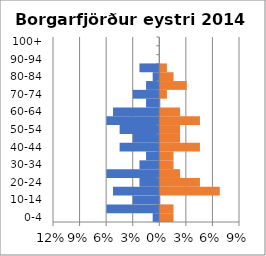
| Category | % Men | % Women |
|---|---|---|
| 0-4 | -0.007 | 0.015 |
| 5-9 | -0.06 | 0.015 |
| 10-14 | -0.03 | 0 |
| 15-19 | -0.052 | 0.067 |
| 20-24 | -0.022 | 0.045 |
| 25-29 | -0.06 | 0.022 |
| 30-34 | -0.022 | 0.015 |
| 35-39 | -0.015 | 0.015 |
| 40-44 | -0.045 | 0.045 |
| 45-49 | -0.03 | 0.022 |
| 50-54 | -0.045 | 0.022 |
| 55-59 | -0.06 | 0.045 |
| 60-64 | -0.052 | 0.022 |
| 65-69 | -0.015 | 0 |
| 70-74 | -0.03 | 0.007 |
| 75-79 | -0.015 | 0.03 |
| 80-84 | -0.007 | 0.015 |
| 85-89 | -0.022 | 0.007 |
| 90-94 | 0 | 0 |
| 95-99 | 0 | 0 |
| 100+ | 0 | 0 |